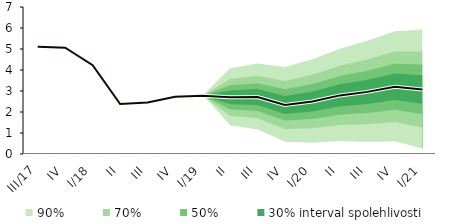
| Category | linka | Centerline |
|---|---|---|
| III/17 | 5.104 | 5.104 |
| IV | 5.062 | 5.062 |
| I/18 | 4.225 | 4.225 |
| II | 2.383 | 2.383 |
| III | 2.458 | 2.458 |
| IV | 2.722 | 2.722 |
| I/19 | 2.769 | 2.769 |
| II | 2.699 | 2.699 |
| III | 2.712 | 2.712 |
| IV | 2.338 | 2.338 |
| I/20 | 2.499 | 2.499 |
| II | 2.791 | 2.791 |
| III | 2.958 | 2.958 |
| IV | 3.205 | 3.205 |
| I/21 | 3.073 | 3.073 |